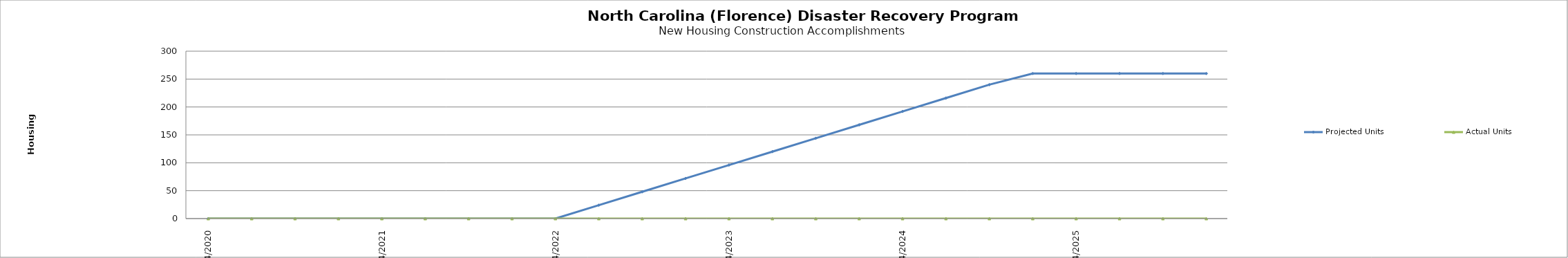
| Category | Projected Units | Actual Units |
|---|---|---|
| 4/2020 | 0 | 0 |
| 7/2020 | 0 | 0 |
| 10/2020 | 0 | 0 |
| 1/2021 | 0 | 0 |
| 4/2021 | 0 | 0 |
| 7/2021 | 0 | 0 |
| 10/2021 | 0 | 0 |
| 1/2022 | 0 | 0 |
| 4/2022 | 0 | 0 |
| 7/2022 | 24 | 0 |
| 10/2022 | 48 | 0 |
| 1/2023 | 72 | 0 |
| 4/2023 | 96 | 0 |
| 7/2023 | 120 | 0 |
| 10/2023 | 144 | 0 |
| 1/2024 | 168 | 0 |
| 4/2024 | 192 | 0 |
| 7/2024 | 216 | 0 |
| 10/2024 | 240 | 0 |
| 1/2025 | 260 | 0 |
| 4/2025 | 260 | 0 |
| 7/2025 | 260 | 0 |
| 10/2025 | 260 | 0 |
| 1/2026 | 260 | 0 |